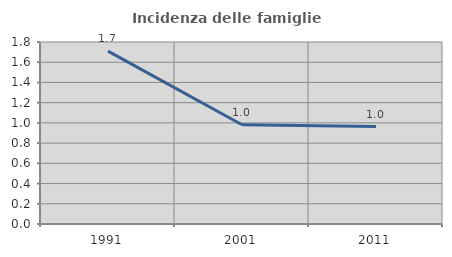
| Category | Incidenza delle famiglie numerose |
|---|---|
| 1991.0 | 1.71 |
| 2001.0 | 0.981 |
| 2011.0 | 0.964 |